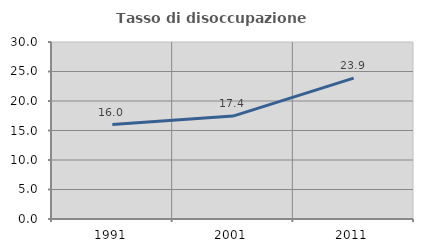
| Category | Tasso di disoccupazione giovanile  |
|---|---|
| 1991.0 | 16 |
| 2001.0 | 17.442 |
| 2011.0 | 23.881 |